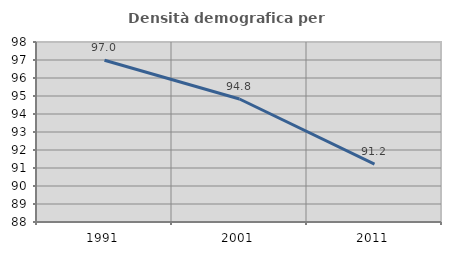
| Category | Densità demografica |
|---|---|
| 1991.0 | 96.988 |
| 2001.0 | 94.832 |
| 2011.0 | 91.219 |